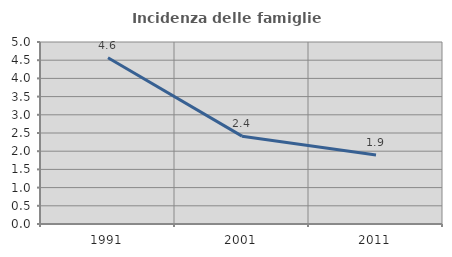
| Category | Incidenza delle famiglie numerose |
|---|---|
| 1991.0 | 4.567 |
| 2001.0 | 2.413 |
| 2011.0 | 1.896 |